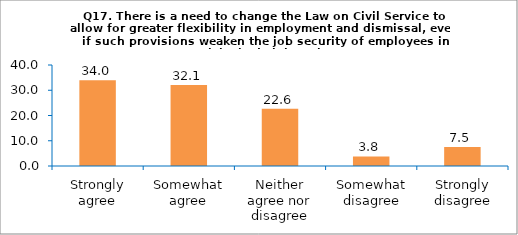
| Category | Series 0 |
|---|---|
| Strongly agree | 33.962 |
| Somewhat agree | 32.075 |
| Neither agree nor disagree | 22.642 |
| Somewhat disagree | 3.774 |
| Strongly disagree | 7.547 |